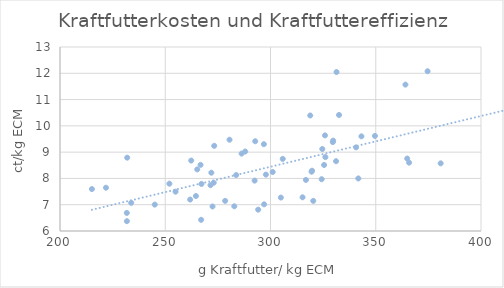
| Category | Series 1 |
|---|---|
| 319.51 | 8.255 |
| 271.51 | 7.743 |
| 272.46 | 6.933 |
| 448.8 | 10.418 |
| 278.45 | 7.146 |
| 231.74 | 6.687 |
| 267.05 | 6.426 |
| 282.8 | 6.94 |
| 273.02 | 7.837 |
| 251.97 | 7.8 |
| 304.92 | 7.272 |
| 215.16 | 7.595 |
| 316.83 | 7.943 |
| 315.23 | 7.282 |
| 287.98 | 9.024 |
| 349.62 | 9.617 |
| 296.96 | 7.015 |
| 266.76 | 8.516 |
| 320.31 | 7.146 |
| 294.15 | 6.812 |
| 280.53 | 9.472 |
| 231.78 | 6.374 |
| 374.62 | 12.077 |
| 380.84 | 8.573 |
| 215.36 | 5.886 |
| 364.94 | 8.757 |
| 301.04 | 8.244 |
| 365.84 | 8.6 |
| 271.9 | 8.217 |
| 326.07 | 8.811 |
| 305.82 | 8.743 |
| 261.84 | 7.197 |
| 292.46 | 7.916 |
| 329.6 | 9.383 |
| 231.93 | 8.79 |
| 325.88 | 9.636 |
| 297.81 | 8.146 |
| 292.74 | 9.415 |
| 324.61 | 9.12 |
| 221.84 | 7.646 |
| 332.55 | 10.414 |
| 343.2 | 9.601 |
| 325.46 | 8.512 |
| 264.57 | 7.331 |
| 331.14 | 8.656 |
| 273.26 | 9.24 |
| 254.89 | 7.496 |
| 245.01 | 7.004 |
| 286.27 | 8.944 |
| 324.31 | 7.97 |
| 265.2 | 8.343 |
| 340.66 | 9.182 |
| 319.74 | 8.294 |
| 407.33 | 11.752 |
| 341.72 | 7.999 |
| 283.68 | 8.129 |
| 329.76 | 9.439 |
| 318.87 | 10.394 |
| 233.82 | 7.072 |
| 262.34 | 8.68 |
| 267.2 | 7.79 |
| 331.37 | 12.047 |
| 364.1 | 11.569 |
| 296.85 | 9.303 |